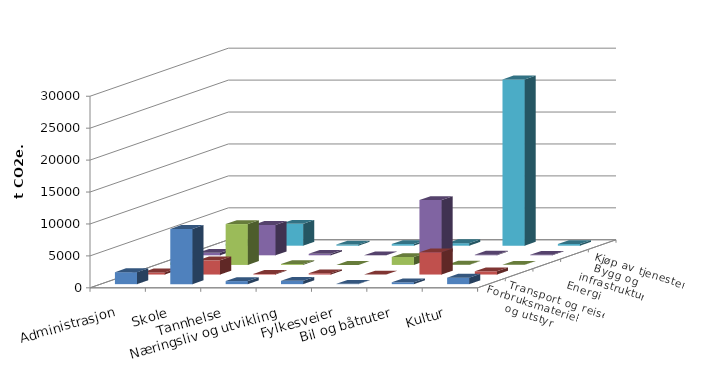
| Category | Forbruksmateriell og utstyr | Transport og reise | Energi | Bygg og infrastruktur | Kjøp av tjenester |
|---|---|---|---|---|---|
| Administrasjon | 1873.482 | 327.466 | 363 | 393.284 | 309.44 |
| Skole | 8655.752 | 2223.064 | 6396.1 | 4754.693 | 3422.92 |
| Tannhelse | 480.113 | 102.749 | 140 | 227.716 | 190.936 |
| Næringsliv og utvikling | 523.683 | 201.423 | 0 | 12.29 | 254.949 |
| Fylkesveier | 45.526 | 1.627 | 1244.75 | 8659.612 | 391.431 |
| Bil og båtruter | 294.788 | 3487.756 | 43 | 93.398 | 26037.641 |
| Kultur | 1018.777 | 504.773 | 14.5 | 90.872 | 260.411 |